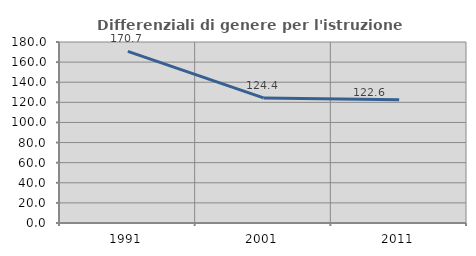
| Category | Differenziali di genere per l'istruzione superiore |
|---|---|
| 1991.0 | 170.658 |
| 2001.0 | 124.424 |
| 2011.0 | 122.622 |